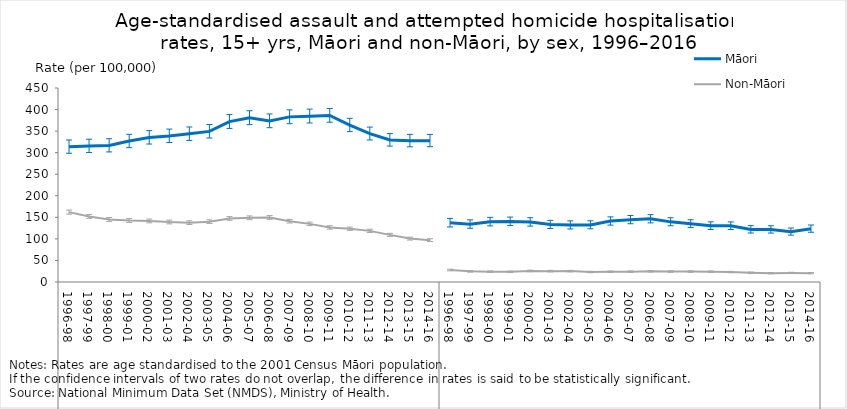
| Category | Māori | Non-Māori |
|---|---|---|
| 0 | 313.75 | 162.105 |
| 1 | 315.517 | 152.11 |
| 2 | 316.795 | 145.088 |
| 3 | 326.843 | 142.557 |
| 4 | 335.304 | 141.624 |
| 5 | 338.831 | 139.13 |
| 6 | 343.698 | 137.679 |
| 7 | 349.379 | 139.999 |
| 8 | 372.079 | 147.436 |
| 9 | 380.895 | 148.956 |
| 10 | 373.597 | 149.626 |
| 11 | 383.024 | 141.012 |
| 12 | 384.726 | 134.821 |
| 13 | 386.354 | 126.556 |
| 14 | 363.999 | 123.575 |
| 15 | 344.14 | 118.591 |
| 16 | 329.447 | 109.266 |
| 17 | 327.788 | 100.663 |
| 18 | 327.849 | 97.095 |
| 19 | 137.301 | 27.755 |
| 20 | 134.145 | 24.655 |
| 21 | 139.812 | 23.921 |
| 22 | 140.506 | 23.553 |
| 23 | 139.128 | 25.636 |
| 24 | 133.237 | 25.165 |
| 25 | 132.183 | 25.299 |
| 26 | 132.486 | 23.162 |
| 27 | 141.301 | 23.713 |
| 28 | 144.477 | 23.969 |
| 29 | 146.503 | 24.696 |
| 30 | 139.499 | 24.202 |
| 31 | 135.073 | 24.154 |
| 32 | 130.411 | 23.899 |
| 33 | 130.316 | 23.017 |
| 34 | 121.927 | 21.4 |
| 35 | 121.756 | 20.545 |
| 36 | 116.711 | 21.036 |
| 37 | 123.554 | 20.524 |